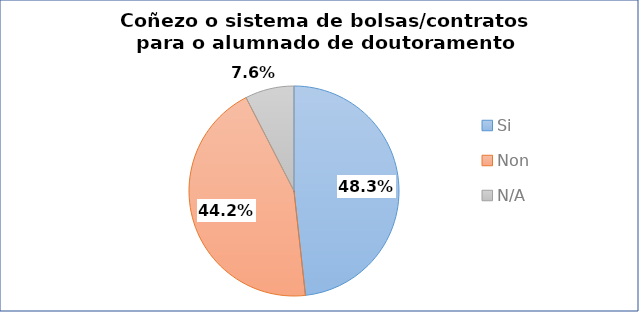
| Category | Series 0 |
|---|---|
| Si | 0.483 |
| Non | 0.442 |
| N/A | 0.076 |